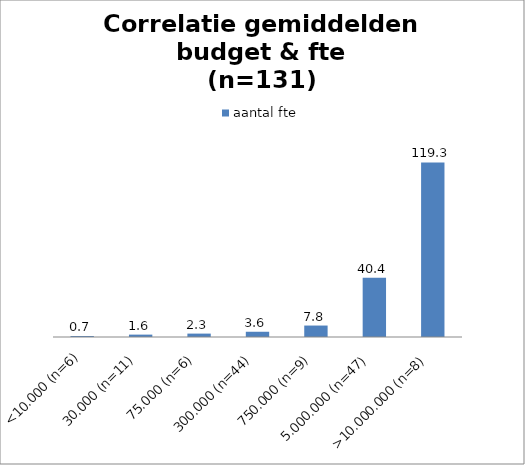
| Category | aantal fte |
|---|---|
| <10.000 (n=6) | 0.667 |
| 30.000 (n=11) | 1.627 |
| 75.000 (n=6) | 2.32 |
| 300.000 (n=44) | 3.582 |
| 750.000 (n=9) | 7.822 |
| 5.000.000 (n=47) | 40.447 |
| >10.000.000 (n=8) | 119.25 |